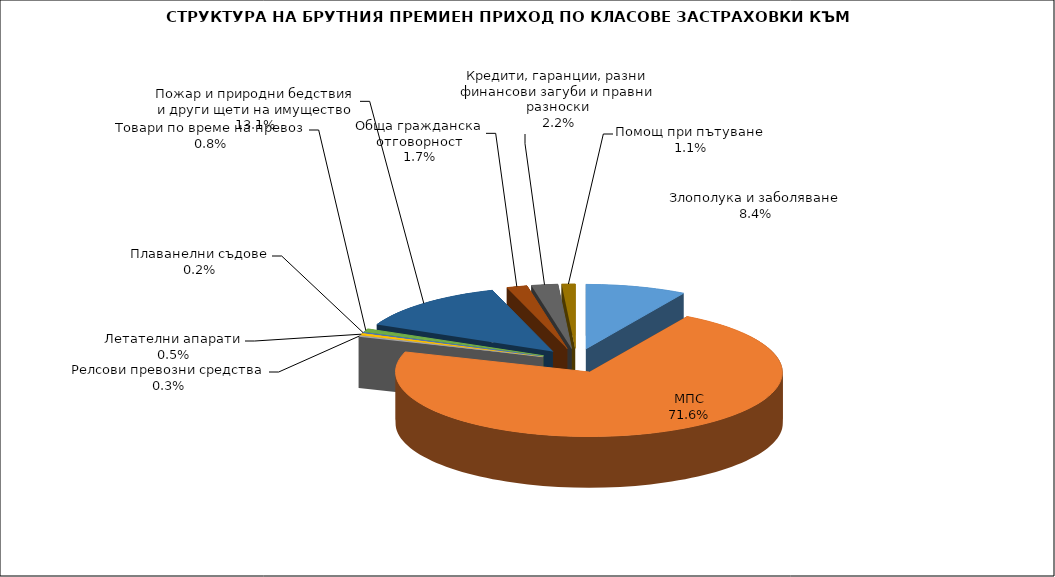
| Category | Злополука и заболяване |
|---|---|
| Злополука и заболяване | 0.084 |
| МПС | 0.716 |
| Релсови превозни средства | 0.003 |
| Летателни апарати | 0.005 |
| Плаванелни съдове | 0.002 |
| Товари по време на превоз | 0.008 |
| Пожар и природни бедствия и други щети на имущество | 0.131 |
| Обща гражданска отговорност | 0.017 |
| Кредити, гаранции, разни финансови загуби и правни разноски | 0.022 |
| Помощ при пътуване | 0.011 |